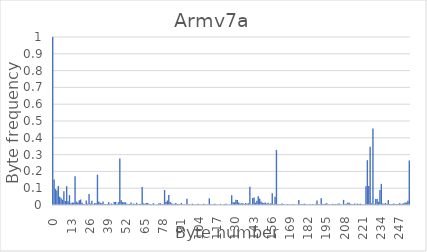
| Category | Series 0 |
|---|---|
| 0.0 | 1 |
| 1.0 | 0.152 |
| 2.0 | 0.095 |
| 3.0 | 0.087 |
| 4.0 | 0.114 |
| 5.0 | 0.049 |
| 6.0 | 0.04 |
| 7.0 | 0.032 |
| 8.0 | 0.081 |
| 9.0 | 0.024 |
| 10.0 | 0.112 |
| 11.0 | 0.022 |
| 12.0 | 0.059 |
| 13.0 | 0.01 |
| 14.0 | 0.014 |
| 15.0 | 0.014 |
| 16.0 | 0.172 |
| 17.0 | 0.02 |
| 18.0 | 0.015 |
| 19.0 | 0.028 |
| 20.0 | 0.033 |
| 21.0 | 0.013 |
| 22.0 | 0.006 |
| 23.0 | 0.006 |
| 24.0 | 0.027 |
| 25.0 | 0.008 |
| 26.0 | 0.066 |
| 27.0 | 0.009 |
| 28.0 | 0.025 |
| 29.0 | 0.005 |
| 30.0 | 0.011 |
| 31.0 | 0.01 |
| 32.0 | 0.181 |
| 33.0 | 0.021 |
| 34.0 | 0.013 |
| 35.0 | 0.01 |
| 36.0 | 0.02 |
| 37.0 | 0.006 |
| 38.0 | 0.005 |
| 39.0 | 0.006 |
| 40.0 | 0.018 |
| 41.0 | 0.006 |
| 42.0 | 0.009 |
| 43.0 | 0.005 |
| 44.0 | 0.018 |
| 45.0 | 0.019 |
| 46.0 | 0.005 |
| 47.0 | 0.017 |
| 48.0 | 0.276 |
| 49.0 | 0.028 |
| 50.0 | 0.017 |
| 51.0 | 0.016 |
| 52.0 | 0.016 |
| 53.0 | 0.007 |
| 54.0 | 0.006 |
| 55.0 | 0.007 |
| 56.0 | 0.014 |
| 57.0 | 0.004 |
| 58.0 | 0.009 |
| 59.0 | 0.005 |
| 60.0 | 0.013 |
| 61.0 | 0.004 |
| 62.0 | 0.006 |
| 63.0 | 0.008 |
| 64.0 | 0.106 |
| 65.0 | 0.009 |
| 66.0 | 0.008 |
| 67.0 | 0.012 |
| 68.0 | 0.012 |
| 69.0 | 0.005 |
| 70.0 | 0.004 |
| 71.0 | 0.005 |
| 72.0 | 0.011 |
| 73.0 | 0.003 |
| 74.0 | 0.003 |
| 75.0 | 0.004 |
| 76.0 | 0.011 |
| 77.0 | 0.01 |
| 78.0 | 0.004 |
| 79.0 | 0.006 |
| 80.0 | 0.089 |
| 81.0 | 0.018 |
| 82.0 | 0.027 |
| 83.0 | 0.06 |
| 84.0 | 0.017 |
| 85.0 | 0.009 |
| 86.0 | 0.008 |
| 87.0 | 0.007 |
| 88.0 | 0.012 |
| 89.0 | 0.006 |
| 90.0 | 0.005 |
| 91.0 | 0.005 |
| 92.0 | 0.012 |
| 93.0 | 0.002 |
| 94.0 | 0.005 |
| 95.0 | 0.003 |
| 96.0 | 0.037 |
| 97.0 | 0.005 |
| 98.0 | 0.003 |
| 99.0 | 0.004 |
| 100.0 | 0.008 |
| 101.0 | 0.003 |
| 102.0 | 0.003 |
| 103.0 | 0.003 |
| 104.0 | 0.008 |
| 105.0 | 0.002 |
| 106.0 | 0.003 |
| 107.0 | 0.003 |
| 108.0 | 0.007 |
| 109.0 | 0.002 |
| 110.0 | 0.002 |
| 111.0 | 0.005 |
| 112.0 | 0.04 |
| 113.0 | 0.004 |
| 114.0 | 0.004 |
| 115.0 | 0.004 |
| 116.0 | 0.007 |
| 117.0 | 0.002 |
| 118.0 | 0.002 |
| 119.0 | 0.002 |
| 120.0 | 0.007 |
| 121.0 | 0.002 |
| 122.0 | 0.003 |
| 123.0 | 0.004 |
| 124.0 | 0.007 |
| 125.0 | 0.002 |
| 126.0 | 0.003 |
| 127.0 | 0.003 |
| 128.0 | 0.058 |
| 129.0 | 0.017 |
| 130.0 | 0.017 |
| 131.0 | 0.031 |
| 132.0 | 0.03 |
| 133.0 | 0.014 |
| 134.0 | 0.01 |
| 135.0 | 0.01 |
| 136.0 | 0.01 |
| 137.0 | 0.005 |
| 138.0 | 0.012 |
| 139.0 | 0.007 |
| 140.0 | 0.011 |
| 141.0 | 0.108 |
| 142.0 | 0.005 |
| 143.0 | 0.041 |
| 144.0 | 0.045 |
| 145.0 | 0.014 |
| 146.0 | 0.026 |
| 147.0 | 0.053 |
| 148.0 | 0.038 |
| 149.0 | 0.021 |
| 150.0 | 0.014 |
| 151.0 | 0.012 |
| 152.0 | 0.015 |
| 153.0 | 0.008 |
| 154.0 | 0.013 |
| 155.0 | 0.007 |
| 156.0 | 0.01 |
| 157.0 | 0.07 |
| 158.0 | 0.005 |
| 159.0 | 0.049 |
| 160.0 | 0.328 |
| 161.0 | 0.004 |
| 162.0 | 0.004 |
| 163.0 | 0.005 |
| 164.0 | 0.008 |
| 165.0 | 0.004 |
| 166.0 | 0.003 |
| 167.0 | 0.003 |
| 168.0 | 0.006 |
| 169.0 | 0.002 |
| 170.0 | 0.004 |
| 171.0 | 0.002 |
| 172.0 | 0.007 |
| 173.0 | 0.002 |
| 174.0 | 0.003 |
| 175.0 | 0.002 |
| 176.0 | 0.029 |
| 177.0 | 0.004 |
| 178.0 | 0.005 |
| 179.0 | 0.007 |
| 180.0 | 0.008 |
| 181.0 | 0.004 |
| 182.0 | 0.003 |
| 183.0 | 0.002 |
| 184.0 | 0.006 |
| 185.0 | 0.002 |
| 186.0 | 0.006 |
| 187.0 | 0.002 |
| 188.0 | 0.006 |
| 189.0 | 0.026 |
| 190.0 | 0.003 |
| 191.0 | 0.004 |
| 192.0 | 0.04 |
| 193.0 | 0.006 |
| 194.0 | 0.006 |
| 195.0 | 0.008 |
| 196.0 | 0.011 |
| 197.0 | 0.005 |
| 198.0 | 0.004 |
| 199.0 | 0.003 |
| 200.0 | 0.007 |
| 201.0 | 0.005 |
| 202.0 | 0.006 |
| 203.0 | 0.004 |
| 204.0 | 0.008 |
| 205.0 | 0.009 |
| 206.0 | 0.004 |
| 207.0 | 0.003 |
| 208.0 | 0.03 |
| 209.0 | 0.006 |
| 210.0 | 0.007 |
| 211.0 | 0.014 |
| 212.0 | 0.013 |
| 213.0 | 0.007 |
| 214.0 | 0.005 |
| 215.0 | 0.005 |
| 216.0 | 0.009 |
| 217.0 | 0.004 |
| 218.0 | 0.008 |
| 219.0 | 0.005 |
| 220.0 | 0.008 |
| 221.0 | 0.004 |
| 222.0 | 0.004 |
| 223.0 | 0.004 |
| 224.0 | 0.112 |
| 225.0 | 0.267 |
| 226.0 | 0.114 |
| 227.0 | 0.347 |
| 228.0 | 0.01 |
| 229.0 | 0.455 |
| 230.0 | 0.006 |
| 231.0 | 0.035 |
| 232.0 | 0.035 |
| 233.0 | 0.02 |
| 234.0 | 0.089 |
| 235.0 | 0.126 |
| 236.0 | 0.008 |
| 237.0 | 0.007 |
| 238.0 | 0.012 |
| 239.0 | 0.006 |
| 240.0 | 0.03 |
| 241.0 | 0.006 |
| 242.0 | 0.005 |
| 243.0 | 0.006 |
| 244.0 | 0.009 |
| 245.0 | 0.006 |
| 246.0 | 0.005 |
| 247.0 | 0.006 |
| 248.0 | 0.011 |
| 249.0 | 0.008 |
| 250.0 | 0.008 |
| 251.0 | 0.01 |
| 252.0 | 0.015 |
| 253.0 | 0.015 |
| 254.0 | 0.026 |
| 255.0 | 0.265 |